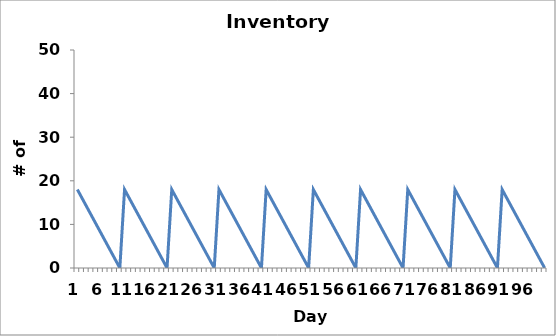
| Category | Ending inventory |
|---|---|
| 0 | 18 |
| 1 | 16 |
| 2 | 14 |
| 3 | 12 |
| 4 | 10 |
| 5 | 8 |
| 6 | 6 |
| 7 | 4 |
| 8 | 2 |
| 9 | 0 |
| 10 | 18 |
| 11 | 16 |
| 12 | 14 |
| 13 | 12 |
| 14 | 10 |
| 15 | 8 |
| 16 | 6 |
| 17 | 4 |
| 18 | 2 |
| 19 | 0 |
| 20 | 18 |
| 21 | 16 |
| 22 | 14 |
| 23 | 12 |
| 24 | 10 |
| 25 | 8 |
| 26 | 6 |
| 27 | 4 |
| 28 | 2 |
| 29 | 0 |
| 30 | 18 |
| 31 | 16 |
| 32 | 14 |
| 33 | 12 |
| 34 | 10 |
| 35 | 8 |
| 36 | 6 |
| 37 | 4 |
| 38 | 2 |
| 39 | 0 |
| 40 | 18 |
| 41 | 16 |
| 42 | 14 |
| 43 | 12 |
| 44 | 10 |
| 45 | 8 |
| 46 | 6 |
| 47 | 4 |
| 48 | 2 |
| 49 | 0 |
| 50 | 18 |
| 51 | 16 |
| 52 | 14 |
| 53 | 12 |
| 54 | 10 |
| 55 | 8 |
| 56 | 6 |
| 57 | 4 |
| 58 | 2 |
| 59 | 0 |
| 60 | 18 |
| 61 | 16 |
| 62 | 14 |
| 63 | 12 |
| 64 | 10 |
| 65 | 8 |
| 66 | 6 |
| 67 | 4 |
| 68 | 2 |
| 69 | 0 |
| 70 | 18 |
| 71 | 16 |
| 72 | 14 |
| 73 | 12 |
| 74 | 10 |
| 75 | 8 |
| 76 | 6 |
| 77 | 4 |
| 78 | 2 |
| 79 | 0 |
| 80 | 18 |
| 81 | 16 |
| 82 | 14 |
| 83 | 12 |
| 84 | 10 |
| 85 | 8 |
| 86 | 6 |
| 87 | 4 |
| 88 | 2 |
| 89 | 0 |
| 90 | 18 |
| 91 | 16 |
| 92 | 14 |
| 93 | 12 |
| 94 | 10 |
| 95 | 8 |
| 96 | 6 |
| 97 | 4 |
| 98 | 2 |
| 99 | 0 |